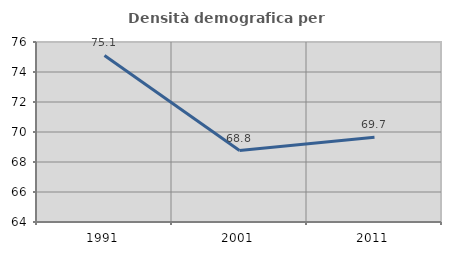
| Category | Densità demografica |
|---|---|
| 1991.0 | 75.106 |
| 2001.0 | 68.765 |
| 2011.0 | 69.652 |